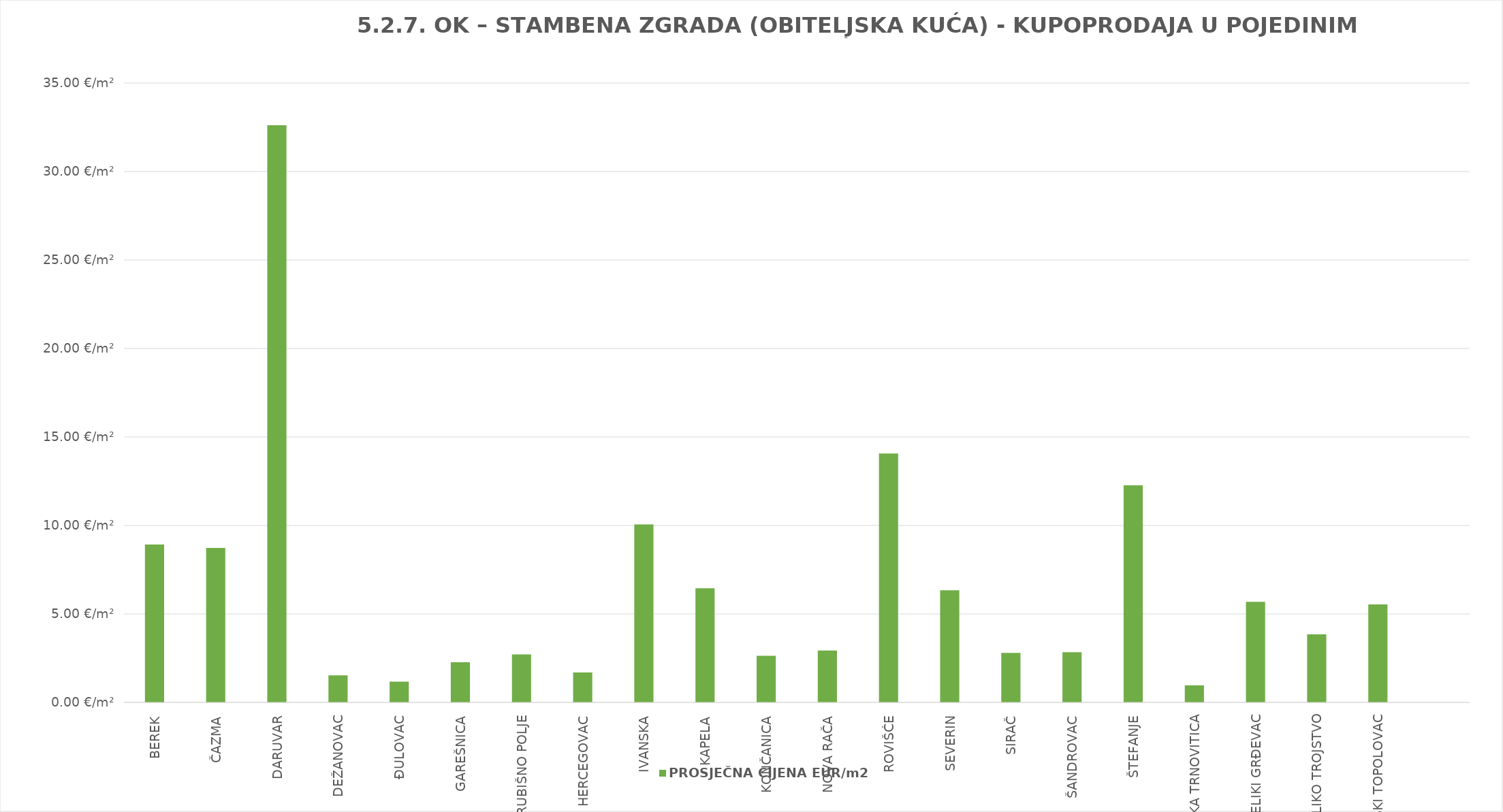
| Category | PROSJEČNA CIJENA EUR/m2 |
|---|---|
| BEREK | 1900-01-08 22:08:58 |
| ČAZMA | 1900-01-08 17:38:14 |
| DARUVAR | 1900-02-01 14:50:13 |
| DEŽANOVAC | 1900-01-01 12:36:08 |
| ĐULOVAC | 1900-01-01 04:10:02 |
| GAREŠNICA | 1900-01-02 06:31:00 |
| GRUBIŠNO POLJE | 1900-01-02 17:00:34 |
| HERCEGOVAC | 1900-01-01 16:41:37 |
| IVANSKA | 1900-01-10 01:20:22 |
| KAPELA | 1900-01-06 10:49:57 |
| KONČANICA | 1900-01-02 15:14:29 |
| NOVA RAČA | 1900-01-02 22:20:20 |
| ROVIŠĆE | 1900-01-14 01:39:14 |
| SEVERIN | 1900-01-06 08:06:25 |
| SIRAČ | 1900-01-02 19:13:31 |
| ŠANDROVAC | 1900-01-02 20:10:31 |
| ŠTEFANJE | 1900-01-12 06:33:46 |
| VELIKA TRNOVITICA | 0.964 |
| VELIKI GRĐEVAC | 1900-01-05 16:20:40 |
| VELIKO TROJSTVO | 1900-01-03 20:20:01 |
| ZRINSKI TOPOLOVAC | 1900-01-05 12:59:06 |